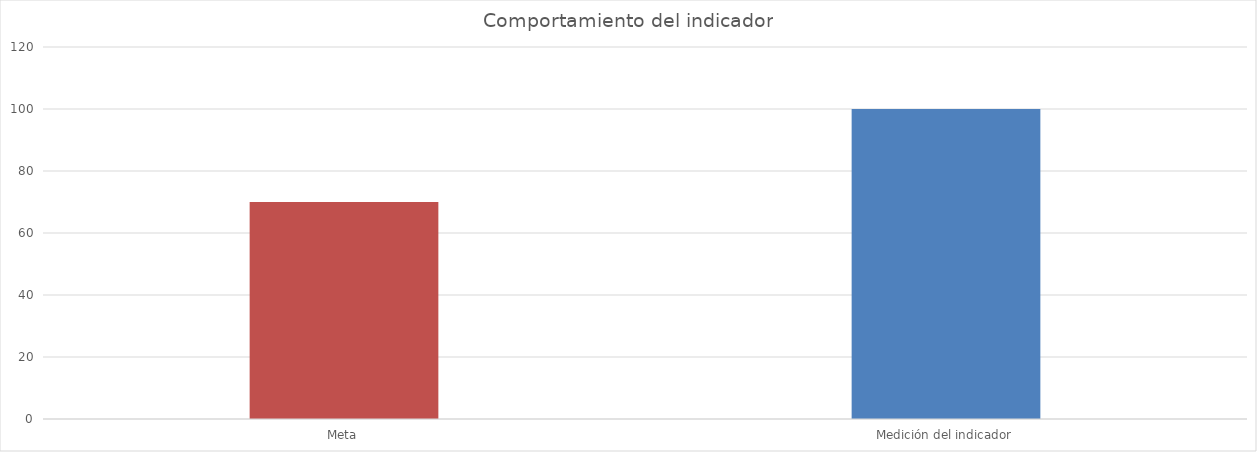
| Category | Series 0 |
|---|---|
| Meta | 70 |
| Medición del indicador | 100 |